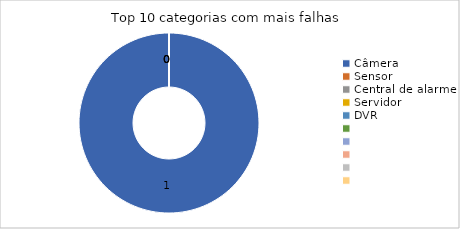
| Category | contagem falhas |
|---|---|
| Câmera | 1 |
| Sensor | 0 |
| Central de alarme | 0 |
| Servidor | 0 |
| DVR | 0 |